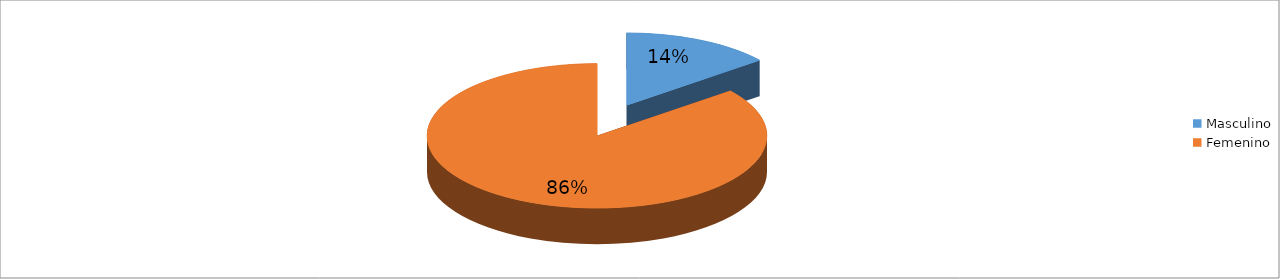
| Category | Series 0 |
|---|---|
| Masculino | 0.143 |
| Femenino | 0.857 |